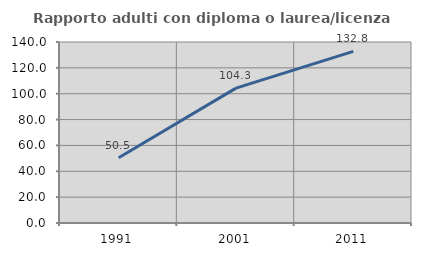
| Category | Rapporto adulti con diploma o laurea/licenza media  |
|---|---|
| 1991.0 | 50.495 |
| 2001.0 | 104.31 |
| 2011.0 | 132.787 |